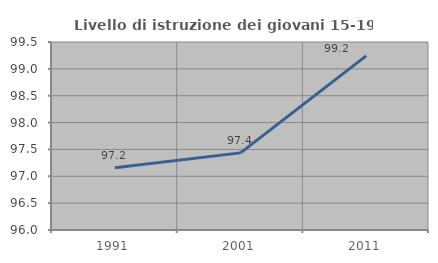
| Category | Livello di istruzione dei giovani 15-19 anni |
|---|---|
| 1991.0 | 97.159 |
| 2001.0 | 97.436 |
| 2011.0 | 99.242 |